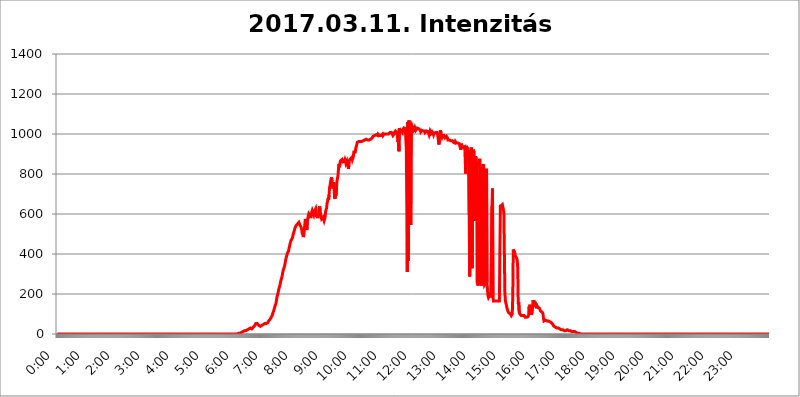
| Category | 2017.03.11. Intenzitás [W/m^2] |
|---|---|
| 0.0 | 0 |
| 0.0006944444444444445 | 0 |
| 0.001388888888888889 | 0 |
| 0.0020833333333333333 | 0 |
| 0.002777777777777778 | 0 |
| 0.003472222222222222 | 0 |
| 0.004166666666666667 | 0 |
| 0.004861111111111111 | 0 |
| 0.005555555555555556 | 0 |
| 0.0062499999999999995 | 0 |
| 0.006944444444444444 | 0 |
| 0.007638888888888889 | 0 |
| 0.008333333333333333 | 0 |
| 0.009027777777777779 | 0 |
| 0.009722222222222222 | 0 |
| 0.010416666666666666 | 0 |
| 0.011111111111111112 | 0 |
| 0.011805555555555555 | 0 |
| 0.012499999999999999 | 0 |
| 0.013194444444444444 | 0 |
| 0.013888888888888888 | 0 |
| 0.014583333333333332 | 0 |
| 0.015277777777777777 | 0 |
| 0.015972222222222224 | 0 |
| 0.016666666666666666 | 0 |
| 0.017361111111111112 | 0 |
| 0.018055555555555557 | 0 |
| 0.01875 | 0 |
| 0.019444444444444445 | 0 |
| 0.02013888888888889 | 0 |
| 0.020833333333333332 | 0 |
| 0.02152777777777778 | 0 |
| 0.022222222222222223 | 0 |
| 0.02291666666666667 | 0 |
| 0.02361111111111111 | 0 |
| 0.024305555555555556 | 0 |
| 0.024999999999999998 | 0 |
| 0.025694444444444447 | 0 |
| 0.02638888888888889 | 0 |
| 0.027083333333333334 | 0 |
| 0.027777777777777776 | 0 |
| 0.02847222222222222 | 0 |
| 0.029166666666666664 | 0 |
| 0.029861111111111113 | 0 |
| 0.030555555555555555 | 0 |
| 0.03125 | 0 |
| 0.03194444444444445 | 0 |
| 0.03263888888888889 | 0 |
| 0.03333333333333333 | 0 |
| 0.034027777777777775 | 0 |
| 0.034722222222222224 | 0 |
| 0.035416666666666666 | 0 |
| 0.036111111111111115 | 0 |
| 0.03680555555555556 | 0 |
| 0.0375 | 0 |
| 0.03819444444444444 | 0 |
| 0.03888888888888889 | 0 |
| 0.03958333333333333 | 0 |
| 0.04027777777777778 | 0 |
| 0.04097222222222222 | 0 |
| 0.041666666666666664 | 0 |
| 0.042361111111111106 | 0 |
| 0.04305555555555556 | 0 |
| 0.043750000000000004 | 0 |
| 0.044444444444444446 | 0 |
| 0.04513888888888889 | 0 |
| 0.04583333333333334 | 0 |
| 0.04652777777777778 | 0 |
| 0.04722222222222222 | 0 |
| 0.04791666666666666 | 0 |
| 0.04861111111111111 | 0 |
| 0.049305555555555554 | 0 |
| 0.049999999999999996 | 0 |
| 0.05069444444444445 | 0 |
| 0.051388888888888894 | 0 |
| 0.052083333333333336 | 0 |
| 0.05277777777777778 | 0 |
| 0.05347222222222222 | 0 |
| 0.05416666666666667 | 0 |
| 0.05486111111111111 | 0 |
| 0.05555555555555555 | 0 |
| 0.05625 | 0 |
| 0.05694444444444444 | 0 |
| 0.057638888888888885 | 0 |
| 0.05833333333333333 | 0 |
| 0.05902777777777778 | 0 |
| 0.059722222222222225 | 0 |
| 0.06041666666666667 | 0 |
| 0.061111111111111116 | 0 |
| 0.06180555555555556 | 0 |
| 0.0625 | 0 |
| 0.06319444444444444 | 0 |
| 0.06388888888888888 | 0 |
| 0.06458333333333334 | 0 |
| 0.06527777777777778 | 0 |
| 0.06597222222222222 | 0 |
| 0.06666666666666667 | 0 |
| 0.06736111111111111 | 0 |
| 0.06805555555555555 | 0 |
| 0.06874999999999999 | 0 |
| 0.06944444444444443 | 0 |
| 0.07013888888888889 | 0 |
| 0.07083333333333333 | 0 |
| 0.07152777777777779 | 0 |
| 0.07222222222222223 | 0 |
| 0.07291666666666667 | 0 |
| 0.07361111111111111 | 0 |
| 0.07430555555555556 | 0 |
| 0.075 | 0 |
| 0.07569444444444444 | 0 |
| 0.0763888888888889 | 0 |
| 0.07708333333333334 | 0 |
| 0.07777777777777778 | 0 |
| 0.07847222222222222 | 0 |
| 0.07916666666666666 | 0 |
| 0.0798611111111111 | 0 |
| 0.08055555555555556 | 0 |
| 0.08125 | 0 |
| 0.08194444444444444 | 0 |
| 0.08263888888888889 | 0 |
| 0.08333333333333333 | 0 |
| 0.08402777777777777 | 0 |
| 0.08472222222222221 | 0 |
| 0.08541666666666665 | 0 |
| 0.08611111111111112 | 0 |
| 0.08680555555555557 | 0 |
| 0.08750000000000001 | 0 |
| 0.08819444444444445 | 0 |
| 0.08888888888888889 | 0 |
| 0.08958333333333333 | 0 |
| 0.09027777777777778 | 0 |
| 0.09097222222222222 | 0 |
| 0.09166666666666667 | 0 |
| 0.09236111111111112 | 0 |
| 0.09305555555555556 | 0 |
| 0.09375 | 0 |
| 0.09444444444444444 | 0 |
| 0.09513888888888888 | 0 |
| 0.09583333333333333 | 0 |
| 0.09652777777777777 | 0 |
| 0.09722222222222222 | 0 |
| 0.09791666666666667 | 0 |
| 0.09861111111111111 | 0 |
| 0.09930555555555555 | 0 |
| 0.09999999999999999 | 0 |
| 0.10069444444444443 | 0 |
| 0.1013888888888889 | 0 |
| 0.10208333333333335 | 0 |
| 0.10277777777777779 | 0 |
| 0.10347222222222223 | 0 |
| 0.10416666666666667 | 0 |
| 0.10486111111111111 | 0 |
| 0.10555555555555556 | 0 |
| 0.10625 | 0 |
| 0.10694444444444444 | 0 |
| 0.1076388888888889 | 0 |
| 0.10833333333333334 | 0 |
| 0.10902777777777778 | 0 |
| 0.10972222222222222 | 0 |
| 0.1111111111111111 | 0 |
| 0.11180555555555556 | 0 |
| 0.11180555555555556 | 0 |
| 0.1125 | 0 |
| 0.11319444444444444 | 0 |
| 0.11388888888888889 | 0 |
| 0.11458333333333333 | 0 |
| 0.11527777777777777 | 0 |
| 0.11597222222222221 | 0 |
| 0.11666666666666665 | 0 |
| 0.1173611111111111 | 0 |
| 0.11805555555555557 | 0 |
| 0.11944444444444445 | 0 |
| 0.12013888888888889 | 0 |
| 0.12083333333333333 | 0 |
| 0.12152777777777778 | 0 |
| 0.12222222222222223 | 0 |
| 0.12291666666666667 | 0 |
| 0.12291666666666667 | 0 |
| 0.12361111111111112 | 0 |
| 0.12430555555555556 | 0 |
| 0.125 | 0 |
| 0.12569444444444444 | 0 |
| 0.12638888888888888 | 0 |
| 0.12708333333333333 | 0 |
| 0.16875 | 0 |
| 0.12847222222222224 | 0 |
| 0.12916666666666668 | 0 |
| 0.12986111111111112 | 0 |
| 0.13055555555555556 | 0 |
| 0.13125 | 0 |
| 0.13194444444444445 | 0 |
| 0.1326388888888889 | 0 |
| 0.13333333333333333 | 0 |
| 0.13402777777777777 | 0 |
| 0.13402777777777777 | 0 |
| 0.13472222222222222 | 0 |
| 0.13541666666666666 | 0 |
| 0.1361111111111111 | 0 |
| 0.13749999999999998 | 0 |
| 0.13819444444444443 | 0 |
| 0.1388888888888889 | 0 |
| 0.13958333333333334 | 0 |
| 0.14027777777777778 | 0 |
| 0.14097222222222222 | 0 |
| 0.14166666666666666 | 0 |
| 0.1423611111111111 | 0 |
| 0.14305555555555557 | 0 |
| 0.14375000000000002 | 0 |
| 0.14444444444444446 | 0 |
| 0.1451388888888889 | 0 |
| 0.1451388888888889 | 0 |
| 0.14652777777777778 | 0 |
| 0.14722222222222223 | 0 |
| 0.14791666666666667 | 0 |
| 0.1486111111111111 | 0 |
| 0.14930555555555555 | 0 |
| 0.15 | 0 |
| 0.15069444444444444 | 0 |
| 0.15138888888888888 | 0 |
| 0.15208333333333332 | 0 |
| 0.15277777777777776 | 0 |
| 0.15347222222222223 | 0 |
| 0.15416666666666667 | 0 |
| 0.15486111111111112 | 0 |
| 0.15555555555555556 | 0 |
| 0.15625 | 0 |
| 0.15694444444444444 | 0 |
| 0.15763888888888888 | 0 |
| 0.15833333333333333 | 0 |
| 0.15902777777777777 | 0 |
| 0.15972222222222224 | 0 |
| 0.16041666666666668 | 0 |
| 0.16111111111111112 | 0 |
| 0.16180555555555556 | 0 |
| 0.1625 | 0 |
| 0.16319444444444445 | 0 |
| 0.1638888888888889 | 0 |
| 0.16458333333333333 | 0 |
| 0.16527777777777777 | 0 |
| 0.16597222222222222 | 0 |
| 0.16666666666666666 | 0 |
| 0.1673611111111111 | 0 |
| 0.16805555555555554 | 0 |
| 0.16874999999999998 | 0 |
| 0.16944444444444443 | 0 |
| 0.17013888888888887 | 0 |
| 0.1708333333333333 | 0 |
| 0.17152777777777775 | 0 |
| 0.17222222222222225 | 0 |
| 0.1729166666666667 | 0 |
| 0.17361111111111113 | 0 |
| 0.17430555555555557 | 0 |
| 0.17500000000000002 | 0 |
| 0.17569444444444446 | 0 |
| 0.1763888888888889 | 0 |
| 0.17708333333333334 | 0 |
| 0.17777777777777778 | 0 |
| 0.17847222222222223 | 0 |
| 0.17916666666666667 | 0 |
| 0.1798611111111111 | 0 |
| 0.18055555555555555 | 0 |
| 0.18125 | 0 |
| 0.18194444444444444 | 0 |
| 0.1826388888888889 | 0 |
| 0.18333333333333335 | 0 |
| 0.1840277777777778 | 0 |
| 0.18472222222222223 | 0 |
| 0.18541666666666667 | 0 |
| 0.18611111111111112 | 0 |
| 0.18680555555555556 | 0 |
| 0.1875 | 0 |
| 0.18819444444444444 | 0 |
| 0.18888888888888888 | 0 |
| 0.18958333333333333 | 0 |
| 0.19027777777777777 | 0 |
| 0.1909722222222222 | 0 |
| 0.19166666666666665 | 0 |
| 0.19236111111111112 | 0 |
| 0.19305555555555554 | 0 |
| 0.19375 | 0 |
| 0.19444444444444445 | 0 |
| 0.1951388888888889 | 0 |
| 0.19583333333333333 | 0 |
| 0.19652777777777777 | 0 |
| 0.19722222222222222 | 0 |
| 0.19791666666666666 | 0 |
| 0.1986111111111111 | 0 |
| 0.19930555555555554 | 0 |
| 0.19999999999999998 | 0 |
| 0.20069444444444443 | 0 |
| 0.20138888888888887 | 0 |
| 0.2020833333333333 | 0 |
| 0.2027777777777778 | 0 |
| 0.2034722222222222 | 0 |
| 0.2041666666666667 | 0 |
| 0.20486111111111113 | 0 |
| 0.20555555555555557 | 0 |
| 0.20625000000000002 | 0 |
| 0.20694444444444446 | 0 |
| 0.2076388888888889 | 0 |
| 0.20833333333333334 | 0 |
| 0.20902777777777778 | 0 |
| 0.20972222222222223 | 0 |
| 0.21041666666666667 | 0 |
| 0.2111111111111111 | 0 |
| 0.21180555555555555 | 0 |
| 0.2125 | 0 |
| 0.21319444444444444 | 0 |
| 0.2138888888888889 | 0 |
| 0.21458333333333335 | 0 |
| 0.2152777777777778 | 0 |
| 0.21597222222222223 | 0 |
| 0.21666666666666667 | 0 |
| 0.21736111111111112 | 0 |
| 0.21805555555555556 | 0 |
| 0.21875 | 0 |
| 0.21944444444444444 | 0 |
| 0.22013888888888888 | 0 |
| 0.22083333333333333 | 0 |
| 0.22152777777777777 | 0 |
| 0.2222222222222222 | 0 |
| 0.22291666666666665 | 0 |
| 0.2236111111111111 | 0 |
| 0.22430555555555556 | 0 |
| 0.225 | 0 |
| 0.22569444444444445 | 0 |
| 0.2263888888888889 | 0 |
| 0.22708333333333333 | 0 |
| 0.22777777777777777 | 0 |
| 0.22847222222222222 | 0 |
| 0.22916666666666666 | 0 |
| 0.2298611111111111 | 0 |
| 0.23055555555555554 | 0 |
| 0.23124999999999998 | 0 |
| 0.23194444444444443 | 0 |
| 0.23263888888888887 | 0 |
| 0.2333333333333333 | 0 |
| 0.2340277777777778 | 0 |
| 0.2347222222222222 | 0 |
| 0.2354166666666667 | 0 |
| 0.23611111111111113 | 0 |
| 0.23680555555555557 | 0 |
| 0.23750000000000002 | 0 |
| 0.23819444444444446 | 0 |
| 0.2388888888888889 | 0 |
| 0.23958333333333334 | 0 |
| 0.24027777777777778 | 0 |
| 0.24097222222222223 | 0 |
| 0.24166666666666667 | 0 |
| 0.2423611111111111 | 0 |
| 0.24305555555555555 | 0 |
| 0.24375 | 0 |
| 0.24444444444444446 | 0 |
| 0.24513888888888888 | 0 |
| 0.24583333333333335 | 0 |
| 0.2465277777777778 | 0 |
| 0.24722222222222223 | 0 |
| 0.24791666666666667 | 0 |
| 0.24861111111111112 | 0 |
| 0.24930555555555556 | 0 |
| 0.25 | 0 |
| 0.25069444444444444 | 0 |
| 0.2513888888888889 | 0 |
| 0.2520833333333333 | 0 |
| 0.25277777777777777 | 0 |
| 0.2534722222222222 | 3.525 |
| 0.25416666666666665 | 3.525 |
| 0.2548611111111111 | 3.525 |
| 0.2555555555555556 | 3.525 |
| 0.25625000000000003 | 3.525 |
| 0.2569444444444445 | 7.887 |
| 0.2576388888888889 | 7.887 |
| 0.25833333333333336 | 7.887 |
| 0.2590277777777778 | 7.887 |
| 0.25972222222222224 | 7.887 |
| 0.2604166666666667 | 12.257 |
| 0.2611111111111111 | 12.257 |
| 0.26180555555555557 | 16.636 |
| 0.2625 | 16.636 |
| 0.26319444444444445 | 16.636 |
| 0.2638888888888889 | 16.636 |
| 0.26458333333333334 | 16.636 |
| 0.2652777777777778 | 16.636 |
| 0.2659722222222222 | 21.024 |
| 0.26666666666666666 | 21.024 |
| 0.2673611111111111 | 21.024 |
| 0.26805555555555555 | 25.419 |
| 0.26875 | 25.419 |
| 0.26944444444444443 | 29.823 |
| 0.2701388888888889 | 29.823 |
| 0.2708333333333333 | 29.823 |
| 0.27152777777777776 | 25.419 |
| 0.2722222222222222 | 25.419 |
| 0.27291666666666664 | 25.419 |
| 0.2736111111111111 | 29.823 |
| 0.2743055555555555 | 29.823 |
| 0.27499999999999997 | 34.234 |
| 0.27569444444444446 | 34.234 |
| 0.27638888888888885 | 38.653 |
| 0.27708333333333335 | 43.079 |
| 0.2777777777777778 | 47.511 |
| 0.27847222222222223 | 51.951 |
| 0.2791666666666667 | 56.398 |
| 0.2798611111111111 | 56.398 |
| 0.28055555555555556 | 51.951 |
| 0.28125 | 51.951 |
| 0.28194444444444444 | 47.511 |
| 0.2826388888888889 | 43.079 |
| 0.2833333333333333 | 43.079 |
| 0.28402777777777777 | 38.653 |
| 0.2847222222222222 | 38.653 |
| 0.28541666666666665 | 43.079 |
| 0.28611111111111115 | 43.079 |
| 0.28680555555555554 | 43.079 |
| 0.28750000000000003 | 47.511 |
| 0.2881944444444445 | 47.511 |
| 0.2888888888888889 | 47.511 |
| 0.28958333333333336 | 47.511 |
| 0.2902777777777778 | 47.511 |
| 0.29097222222222224 | 51.951 |
| 0.2916666666666667 | 51.951 |
| 0.2923611111111111 | 51.951 |
| 0.29305555555555557 | 51.951 |
| 0.29375 | 56.398 |
| 0.29444444444444445 | 56.398 |
| 0.2951388888888889 | 56.398 |
| 0.29583333333333334 | 60.85 |
| 0.2965277777777778 | 65.31 |
| 0.2972222222222222 | 65.31 |
| 0.29791666666666666 | 69.775 |
| 0.2986111111111111 | 74.246 |
| 0.29930555555555555 | 78.722 |
| 0.3 | 83.205 |
| 0.30069444444444443 | 87.692 |
| 0.3013888888888889 | 92.184 |
| 0.3020833333333333 | 101.184 |
| 0.30277777777777776 | 105.69 |
| 0.3034722222222222 | 114.716 |
| 0.30416666666666664 | 123.758 |
| 0.3048611111111111 | 132.814 |
| 0.3055555555555555 | 141.884 |
| 0.30624999999999997 | 146.423 |
| 0.3069444444444444 | 155.509 |
| 0.3076388888888889 | 173.709 |
| 0.30833333333333335 | 187.378 |
| 0.3090277777777778 | 191.937 |
| 0.30972222222222223 | 205.62 |
| 0.3104166666666667 | 219.309 |
| 0.3111111111111111 | 228.436 |
| 0.31180555555555556 | 237.564 |
| 0.3125 | 246.689 |
| 0.31319444444444444 | 260.373 |
| 0.3138888888888889 | 269.49 |
| 0.3145833333333333 | 274.047 |
| 0.31527777777777777 | 287.709 |
| 0.3159722222222222 | 301.354 |
| 0.31666666666666665 | 314.98 |
| 0.31736111111111115 | 324.052 |
| 0.31805555555555554 | 328.584 |
| 0.31875000000000003 | 337.639 |
| 0.3194444444444445 | 351.198 |
| 0.3201388888888889 | 364.728 |
| 0.32083333333333336 | 378.224 |
| 0.3215277777777778 | 387.202 |
| 0.32222222222222224 | 396.164 |
| 0.3229166666666667 | 405.108 |
| 0.3236111111111111 | 409.574 |
| 0.32430555555555557 | 414.035 |
| 0.325 | 427.39 |
| 0.32569444444444445 | 436.27 |
| 0.3263888888888889 | 449.551 |
| 0.32708333333333334 | 458.38 |
| 0.3277777777777778 | 467.187 |
| 0.3284722222222222 | 471.582 |
| 0.32916666666666666 | 471.582 |
| 0.3298611111111111 | 480.356 |
| 0.33055555555555555 | 493.475 |
| 0.33125 | 502.192 |
| 0.33194444444444443 | 510.885 |
| 0.3326388888888889 | 519.555 |
| 0.3333333333333333 | 528.2 |
| 0.3340277777777778 | 532.513 |
| 0.3347222222222222 | 541.121 |
| 0.3354166666666667 | 545.416 |
| 0.3361111111111111 | 545.416 |
| 0.3368055555555556 | 549.704 |
| 0.33749999999999997 | 553.986 |
| 0.33819444444444446 | 549.704 |
| 0.33888888888888885 | 558.261 |
| 0.33958333333333335 | 558.261 |
| 0.34027777777777773 | 545.416 |
| 0.34097222222222223 | 545.416 |
| 0.3416666666666666 | 536.82 |
| 0.3423611111111111 | 541.121 |
| 0.3430555555555555 | 519.555 |
| 0.34375 | 497.836 |
| 0.3444444444444445 | 523.88 |
| 0.3451388888888889 | 484.735 |
| 0.3458333333333334 | 493.475 |
| 0.34652777777777777 | 497.836 |
| 0.34722222222222227 | 493.475 |
| 0.34791666666666665 | 575.299 |
| 0.34861111111111115 | 575.299 |
| 0.34930555555555554 | 553.986 |
| 0.35000000000000003 | 519.555 |
| 0.3506944444444444 | 558.261 |
| 0.3513888888888889 | 562.53 |
| 0.3520833333333333 | 592.233 |
| 0.3527777777777778 | 600.661 |
| 0.3534722222222222 | 600.661 |
| 0.3541666666666667 | 592.233 |
| 0.3548611111111111 | 592.233 |
| 0.35555555555555557 | 579.542 |
| 0.35625 | 600.661 |
| 0.35694444444444445 | 609.062 |
| 0.3576388888888889 | 617.436 |
| 0.35833333333333334 | 621.613 |
| 0.3590277777777778 | 617.436 |
| 0.3597222222222222 | 596.45 |
| 0.36041666666666666 | 609.062 |
| 0.3611111111111111 | 609.062 |
| 0.36180555555555555 | 609.062 |
| 0.3625 | 625.784 |
| 0.36319444444444443 | 621.613 |
| 0.3638888888888889 | 583.779 |
| 0.3645833333333333 | 592.233 |
| 0.3652777777777778 | 579.542 |
| 0.3659722222222222 | 588.009 |
| 0.3666666666666667 | 600.661 |
| 0.3673611111111111 | 629.948 |
| 0.3680555555555556 | 638.256 |
| 0.36874999999999997 | 617.436 |
| 0.36944444444444446 | 596.45 |
| 0.37013888888888885 | 592.233 |
| 0.37083333333333335 | 575.299 |
| 0.37152777777777773 | 579.542 |
| 0.37222222222222223 | 575.299 |
| 0.3729166666666666 | 583.779 |
| 0.3736111111111111 | 575.299 |
| 0.3743055555555555 | 566.793 |
| 0.375 | 575.299 |
| 0.3756944444444445 | 583.779 |
| 0.3763888888888889 | 613.252 |
| 0.3770833333333334 | 617.436 |
| 0.37777777777777777 | 629.948 |
| 0.37847222222222227 | 654.791 |
| 0.37916666666666665 | 663.019 |
| 0.37986111111111115 | 679.395 |
| 0.38055555555555554 | 671.22 |
| 0.38125000000000003 | 695.666 |
| 0.3819444444444444 | 731.896 |
| 0.3826388888888889 | 743.859 |
| 0.3833333333333333 | 743.859 |
| 0.3840277777777778 | 775.492 |
| 0.3847222222222222 | 783.342 |
| 0.3854166666666667 | 763.674 |
| 0.3861111111111111 | 727.896 |
| 0.38680555555555557 | 739.877 |
| 0.3875 | 759.723 |
| 0.38819444444444445 | 743.859 |
| 0.3888888888888889 | 683.473 |
| 0.38958333333333334 | 675.311 |
| 0.3902777777777778 | 703.762 |
| 0.3909722222222222 | 691.608 |
| 0.39166666666666666 | 731.896 |
| 0.3923611111111111 | 767.62 |
| 0.39305555555555555 | 767.62 |
| 0.39375 | 791.169 |
| 0.39444444444444443 | 826.123 |
| 0.3951388888888889 | 849.199 |
| 0.3958333333333333 | 833.834 |
| 0.3965277777777778 | 853.029 |
| 0.3972222222222222 | 864.493 |
| 0.3979166666666667 | 860.676 |
| 0.3986111111111111 | 868.305 |
| 0.3993055555555556 | 872.114 |
| 0.39999999999999997 | 872.114 |
| 0.40069444444444446 | 860.676 |
| 0.40138888888888885 | 864.493 |
| 0.40208333333333335 | 860.676 |
| 0.40277777777777773 | 864.493 |
| 0.40347222222222223 | 872.114 |
| 0.4041666666666666 | 864.493 |
| 0.4048611111111111 | 853.029 |
| 0.4055555555555555 | 853.029 |
| 0.40625 | 864.493 |
| 0.4069444444444445 | 853.029 |
| 0.4076388888888889 | 841.526 |
| 0.4083333333333334 | 826.123 |
| 0.40902777777777777 | 845.365 |
| 0.40972222222222227 | 868.305 |
| 0.41041666666666665 | 868.305 |
| 0.41111111111111115 | 875.918 |
| 0.41180555555555554 | 872.114 |
| 0.41250000000000003 | 872.114 |
| 0.4131944444444444 | 883.516 |
| 0.4138888888888889 | 872.114 |
| 0.4145833333333333 | 868.305 |
| 0.4152777777777778 | 887.309 |
| 0.4159722222222222 | 909.996 |
| 0.4166666666666667 | 913.766 |
| 0.4173611111111111 | 913.766 |
| 0.41805555555555557 | 909.996 |
| 0.41875 | 928.819 |
| 0.41944444444444445 | 928.819 |
| 0.4201388888888889 | 947.58 |
| 0.42083333333333334 | 958.814 |
| 0.4215277777777778 | 958.814 |
| 0.4222222222222222 | 958.814 |
| 0.42291666666666666 | 962.555 |
| 0.4236111111111111 | 962.555 |
| 0.42430555555555555 | 962.555 |
| 0.425 | 962.555 |
| 0.42569444444444443 | 966.295 |
| 0.4263888888888889 | 966.295 |
| 0.4270833333333333 | 962.555 |
| 0.4277777777777778 | 966.295 |
| 0.4284722222222222 | 966.295 |
| 0.4291666666666667 | 966.295 |
| 0.4298611111111111 | 962.555 |
| 0.4305555555555556 | 966.295 |
| 0.43124999999999997 | 970.034 |
| 0.43194444444444446 | 970.034 |
| 0.43263888888888885 | 973.772 |
| 0.43333333333333335 | 973.772 |
| 0.43402777777777773 | 977.508 |
| 0.43472222222222223 | 973.772 |
| 0.4354166666666666 | 970.034 |
| 0.4361111111111111 | 973.772 |
| 0.4368055555555555 | 973.772 |
| 0.4375 | 970.034 |
| 0.4381944444444445 | 970.034 |
| 0.4388888888888889 | 973.772 |
| 0.4395833333333334 | 973.772 |
| 0.44027777777777777 | 973.772 |
| 0.44097222222222227 | 977.508 |
| 0.44166666666666665 | 981.244 |
| 0.44236111111111115 | 984.98 |
| 0.44305555555555554 | 988.714 |
| 0.44375000000000003 | 988.714 |
| 0.4444444444444444 | 992.448 |
| 0.4451388888888889 | 992.448 |
| 0.4458333333333333 | 992.448 |
| 0.4465277777777778 | 996.182 |
| 0.4472222222222222 | 996.182 |
| 0.4479166666666667 | 996.182 |
| 0.4486111111111111 | 992.448 |
| 0.44930555555555557 | 992.448 |
| 0.45 | 999.916 |
| 0.45069444444444445 | 996.182 |
| 0.4513888888888889 | 996.182 |
| 0.45208333333333334 | 992.448 |
| 0.4527777777777778 | 992.448 |
| 0.4534722222222222 | 992.448 |
| 0.45416666666666666 | 992.448 |
| 0.4548611111111111 | 992.448 |
| 0.45555555555555555 | 992.448 |
| 0.45625 | 999.916 |
| 0.45694444444444443 | 992.448 |
| 0.4576388888888889 | 988.714 |
| 0.4583333333333333 | 999.916 |
| 0.4590277777777778 | 999.916 |
| 0.4597222222222222 | 999.916 |
| 0.4604166666666667 | 999.916 |
| 0.4611111111111111 | 999.916 |
| 0.4618055555555556 | 999.916 |
| 0.46249999999999997 | 999.916 |
| 0.46319444444444446 | 999.916 |
| 0.46388888888888885 | 999.916 |
| 0.46458333333333335 | 999.916 |
| 0.46527777777777773 | 1003.65 |
| 0.46597222222222223 | 1003.65 |
| 0.4666666666666666 | 1007.383 |
| 0.4673611111111111 | 1007.383 |
| 0.4680555555555555 | 1003.65 |
| 0.46875 | 1007.383 |
| 0.4694444444444445 | 1007.383 |
| 0.4701388888888889 | 1003.65 |
| 0.4708333333333334 | 992.448 |
| 0.47152777777777777 | 988.714 |
| 0.47222222222222227 | 999.916 |
| 0.47291666666666665 | 1007.383 |
| 0.47361111111111115 | 1011.118 |
| 0.47430555555555554 | 1014.852 |
| 0.47500000000000003 | 1018.587 |
| 0.4756944444444444 | 1011.118 |
| 0.4763888888888889 | 1007.383 |
| 0.4770833333333333 | 992.448 |
| 0.4777777777777778 | 958.814 |
| 0.4784722222222222 | 977.508 |
| 0.4791666666666667 | 913.766 |
| 0.4798611111111111 | 1029.798 |
| 0.48055555555555557 | 1014.852 |
| 0.48125 | 1018.587 |
| 0.48194444444444445 | 1014.852 |
| 0.4826388888888889 | 1014.852 |
| 0.48333333333333334 | 1018.587 |
| 0.4840277777777778 | 1007.383 |
| 0.4847222222222222 | 1022.323 |
| 0.48541666666666666 | 1022.323 |
| 0.4861111111111111 | 1029.798 |
| 0.48680555555555555 | 1026.06 |
| 0.4875 | 1029.798 |
| 0.48819444444444443 | 1026.06 |
| 0.4888888888888889 | 1022.323 |
| 0.4895833333333333 | 925.06 |
| 0.4902777777777778 | 638.256 |
| 0.4909722222222222 | 310.44 |
| 0.4916666666666667 | 1059.756 |
| 0.4923611111111111 | 364.728 |
| 0.4930555555555556 | 1067.267 |
| 0.49374999999999997 | 1059.756 |
| 0.49444444444444446 | 1044.762 |
| 0.49513888888888885 | 1022.323 |
| 0.49583333333333335 | 545.416 |
| 0.49652777777777773 | 1037.277 |
| 0.49722222222222223 | 1044.762 |
| 0.4979166666666666 | 1037.277 |
| 0.4986111111111111 | 1037.277 |
| 0.4993055555555555 | 1029.798 |
| 0.5 | 1022.323 |
| 0.5006944444444444 | 1018.587 |
| 0.5013888888888889 | 1033.537 |
| 0.5020833333333333 | 1026.06 |
| 0.5027777777777778 | 1018.587 |
| 0.5034722222222222 | 1022.323 |
| 0.5041666666666667 | 1022.323 |
| 0.5048611111111111 | 1029.798 |
| 0.5055555555555555 | 1026.06 |
| 0.50625 | 1026.06 |
| 0.5069444444444444 | 1026.06 |
| 0.5076388888888889 | 1026.06 |
| 0.5083333333333333 | 1022.323 |
| 0.5090277777777777 | 1018.587 |
| 0.5097222222222222 | 1011.118 |
| 0.5104166666666666 | 1014.852 |
| 0.5111111111111112 | 1018.587 |
| 0.5118055555555555 | 1014.852 |
| 0.5125000000000001 | 1014.852 |
| 0.5131944444444444 | 1014.852 |
| 0.513888888888889 | 1014.852 |
| 0.5145833333333333 | 1014.852 |
| 0.5152777777777778 | 1014.852 |
| 0.5159722222222222 | 1007.383 |
| 0.5166666666666667 | 1007.383 |
| 0.517361111111111 | 1007.383 |
| 0.5180555555555556 | 1014.852 |
| 0.5187499999999999 | 1018.587 |
| 0.5194444444444445 | 1018.587 |
| 0.5201388888888888 | 1011.118 |
| 0.5208333333333334 | 1011.118 |
| 0.5215277777777778 | 996.182 |
| 0.5222222222222223 | 999.916 |
| 0.5229166666666667 | 1014.852 |
| 0.5236111111111111 | 1014.852 |
| 0.5243055555555556 | 1003.65 |
| 0.525 | 1003.65 |
| 0.5256944444444445 | 1011.118 |
| 0.5263888888888889 | 1011.118 |
| 0.5270833333333333 | 1003.65 |
| 0.5277777777777778 | 996.182 |
| 0.5284722222222222 | 1003.65 |
| 0.5291666666666667 | 1007.383 |
| 0.5298611111111111 | 1007.383 |
| 0.5305555555555556 | 1007.383 |
| 0.53125 | 1007.383 |
| 0.5319444444444444 | 1011.118 |
| 0.5326388888888889 | 1007.383 |
| 0.5333333333333333 | 999.916 |
| 0.5340277777777778 | 999.916 |
| 0.5347222222222222 | 1003.65 |
| 0.5354166666666667 | 947.58 |
| 0.5361111111111111 | 988.714 |
| 0.5368055555555555 | 1007.383 |
| 0.5375 | 1018.587 |
| 0.5381944444444444 | 1003.65 |
| 0.5388888888888889 | 992.448 |
| 0.5395833333333333 | 984.98 |
| 0.5402777777777777 | 992.448 |
| 0.5409722222222222 | 996.182 |
| 0.5416666666666666 | 992.448 |
| 0.5423611111111112 | 992.448 |
| 0.5430555555555555 | 992.448 |
| 0.5437500000000001 | 981.244 |
| 0.5444444444444444 | 984.98 |
| 0.545138888888889 | 984.98 |
| 0.5458333333333333 | 988.714 |
| 0.5465277777777778 | 988.714 |
| 0.5472222222222222 | 981.244 |
| 0.5479166666666667 | 970.034 |
| 0.548611111111111 | 970.034 |
| 0.5493055555555556 | 973.772 |
| 0.5499999999999999 | 970.034 |
| 0.5506944444444445 | 970.034 |
| 0.5513888888888888 | 966.295 |
| 0.5520833333333334 | 966.295 |
| 0.5527777777777778 | 970.034 |
| 0.5534722222222223 | 966.295 |
| 0.5541666666666667 | 966.295 |
| 0.5548611111111111 | 966.295 |
| 0.5555555555555556 | 958.814 |
| 0.55625 | 955.071 |
| 0.5569444444444445 | 955.071 |
| 0.5576388888888889 | 955.071 |
| 0.5583333333333333 | 962.555 |
| 0.5590277777777778 | 962.555 |
| 0.5597222222222222 | 955.071 |
| 0.5604166666666667 | 951.327 |
| 0.5611111111111111 | 955.071 |
| 0.5618055555555556 | 955.071 |
| 0.5625 | 955.071 |
| 0.5631944444444444 | 951.327 |
| 0.5638888888888889 | 951.327 |
| 0.5645833333333333 | 955.071 |
| 0.5652777777777778 | 951.327 |
| 0.5659722222222222 | 921.298 |
| 0.5666666666666667 | 951.327 |
| 0.5673611111111111 | 943.832 |
| 0.5680555555555555 | 940.082 |
| 0.56875 | 940.082 |
| 0.5694444444444444 | 932.576 |
| 0.5701388888888889 | 932.576 |
| 0.5708333333333333 | 936.33 |
| 0.5715277777777777 | 936.33 |
| 0.5722222222222222 | 940.082 |
| 0.5729166666666666 | 802.868 |
| 0.5736111111111112 | 940.082 |
| 0.5743055555555555 | 943.832 |
| 0.5750000000000001 | 943.832 |
| 0.5756944444444444 | 925.06 |
| 0.576388888888889 | 909.996 |
| 0.5770833333333333 | 917.534 |
| 0.5777777777777778 | 596.45 |
| 0.5784722222222222 | 287.709 |
| 0.5791666666666667 | 562.53 |
| 0.579861111111111 | 898.668 |
| 0.5805555555555556 | 932.576 |
| 0.5812499999999999 | 917.534 |
| 0.5819444444444445 | 328.584 |
| 0.5826388888888888 | 795.074 |
| 0.5833333333333334 | 921.298 |
| 0.5840277777777778 | 917.534 |
| 0.5847222222222223 | 909.996 |
| 0.5854166666666667 | 909.996 |
| 0.5861111111111111 | 566.793 |
| 0.5868055555555556 | 887.309 |
| 0.5875 | 875.918 |
| 0.5881944444444445 | 856.855 |
| 0.5888888888888889 | 260.373 |
| 0.5895833333333333 | 251.251 |
| 0.5902777777777778 | 242.127 |
| 0.5909722222222222 | 237.564 |
| 0.5916666666666667 | 278.603 |
| 0.5923611111111111 | 875.918 |
| 0.5930555555555556 | 829.981 |
| 0.59375 | 833.834 |
| 0.5944444444444444 | 841.526 |
| 0.5951388888888889 | 242.127 |
| 0.5958333333333333 | 747.834 |
| 0.5965277777777778 | 845.365 |
| 0.5972222222222222 | 837.682 |
| 0.5979166666666667 | 849.199 |
| 0.5986111111111111 | 274.047 |
| 0.5993055555555555 | 246.689 |
| 0.6 | 251.251 |
| 0.6006944444444444 | 255.813 |
| 0.6013888888888889 | 269.49 |
| 0.6020833333333333 | 826.123 |
| 0.6027777777777777 | 255.813 |
| 0.6034722222222222 | 219.309 |
| 0.6041666666666666 | 191.937 |
| 0.6048611111111112 | 182.82 |
| 0.6055555555555555 | 182.82 |
| 0.6062500000000001 | 191.937 |
| 0.6069444444444444 | 196.497 |
| 0.607638888888889 | 201.058 |
| 0.6083333333333333 | 182.82 |
| 0.6090277777777778 | 182.82 |
| 0.6097222222222222 | 638.256 |
| 0.6104166666666667 | 727.896 |
| 0.611111111111111 | 182.82 |
| 0.6118055555555556 | 164.605 |
| 0.6124999999999999 | 164.605 |
| 0.6131944444444445 | 160.056 |
| 0.6138888888888888 | 164.605 |
| 0.6145833333333334 | 164.605 |
| 0.6152777777777778 | 164.605 |
| 0.6159722222222223 | 164.605 |
| 0.6166666666666667 | 164.605 |
| 0.6173611111111111 | 164.605 |
| 0.6180555555555556 | 164.605 |
| 0.61875 | 160.056 |
| 0.6194444444444445 | 160.056 |
| 0.6201388888888889 | 164.605 |
| 0.6208333333333333 | 427.39 |
| 0.6215277777777778 | 646.537 |
| 0.6222222222222222 | 638.256 |
| 0.6229166666666667 | 642.4 |
| 0.6236111111111111 | 638.256 |
| 0.6243055555555556 | 646.537 |
| 0.625 | 634.105 |
| 0.6256944444444444 | 621.613 |
| 0.6263888888888889 | 609.062 |
| 0.6270833333333333 | 604.864 |
| 0.6277777777777778 | 210.182 |
| 0.6284722222222222 | 169.156 |
| 0.6291666666666667 | 155.509 |
| 0.6298611111111111 | 146.423 |
| 0.6305555555555555 | 132.814 |
| 0.63125 | 123.758 |
| 0.6319444444444444 | 114.716 |
| 0.6326388888888889 | 110.201 |
| 0.6333333333333333 | 105.69 |
| 0.6340277777777777 | 105.69 |
| 0.6347222222222222 | 101.184 |
| 0.6354166666666666 | 101.184 |
| 0.6361111111111112 | 96.682 |
| 0.6368055555555555 | 92.184 |
| 0.6375000000000001 | 96.682 |
| 0.6381944444444444 | 101.184 |
| 0.638888888888889 | 187.378 |
| 0.6395833333333333 | 422.943 |
| 0.6402777777777778 | 422.943 |
| 0.6409722222222222 | 418.492 |
| 0.6416666666666667 | 405.108 |
| 0.642361111111111 | 391.685 |
| 0.6430555555555556 | 387.202 |
| 0.6437499999999999 | 387.202 |
| 0.6444444444444445 | 378.224 |
| 0.6451388888888888 | 369.23 |
| 0.6458333333333334 | 328.584 |
| 0.6465277777777778 | 150.964 |
| 0.6472222222222223 | 160.056 |
| 0.6479166666666667 | 110.201 |
| 0.6486111111111111 | 101.184 |
| 0.6493055555555556 | 96.682 |
| 0.65 | 96.682 |
| 0.6506944444444445 | 92.184 |
| 0.6513888888888889 | 92.184 |
| 0.6520833333333333 | 92.184 |
| 0.6527777777777778 | 92.184 |
| 0.6534722222222222 | 92.184 |
| 0.6541666666666667 | 92.184 |
| 0.6548611111111111 | 92.184 |
| 0.6555555555555556 | 87.692 |
| 0.65625 | 83.205 |
| 0.6569444444444444 | 83.205 |
| 0.6576388888888889 | 83.205 |
| 0.6583333333333333 | 83.205 |
| 0.6590277777777778 | 83.205 |
| 0.6597222222222222 | 83.205 |
| 0.6604166666666667 | 87.692 |
| 0.6611111111111111 | 96.682 |
| 0.6618055555555555 | 137.347 |
| 0.6625 | 110.201 |
| 0.6631944444444444 | 146.423 |
| 0.6638888888888889 | 105.69 |
| 0.6645833333333333 | 137.347 |
| 0.6652777777777777 | 96.682 |
| 0.6659722222222222 | 92.184 |
| 0.6666666666666666 | 132.814 |
| 0.6673611111111111 | 169.156 |
| 0.6680555555555556 | 169.156 |
| 0.6687500000000001 | 146.423 |
| 0.6694444444444444 | 150.964 |
| 0.6701388888888888 | 155.509 |
| 0.6708333333333334 | 155.509 |
| 0.6715277777777778 | 146.423 |
| 0.6722222222222222 | 128.284 |
| 0.6729166666666666 | 141.884 |
| 0.6736111111111112 | 137.347 |
| 0.6743055555555556 | 132.814 |
| 0.6749999999999999 | 137.347 |
| 0.6756944444444444 | 132.814 |
| 0.6763888888888889 | 128.284 |
| 0.6770833333333334 | 128.284 |
| 0.6777777777777777 | 114.716 |
| 0.6784722222222223 | 119.235 |
| 0.6791666666666667 | 110.201 |
| 0.6798611111111111 | 110.201 |
| 0.6805555555555555 | 110.201 |
| 0.68125 | 101.184 |
| 0.6819444444444445 | 78.722 |
| 0.6826388888888889 | 65.31 |
| 0.6833333333333332 | 65.31 |
| 0.6840277777777778 | 65.31 |
| 0.6847222222222222 | 69.775 |
| 0.6854166666666667 | 65.31 |
| 0.686111111111111 | 65.31 |
| 0.6868055555555556 | 65.31 |
| 0.6875 | 65.31 |
| 0.6881944444444444 | 65.31 |
| 0.688888888888889 | 65.31 |
| 0.6895833333333333 | 65.31 |
| 0.6902777777777778 | 60.85 |
| 0.6909722222222222 | 60.85 |
| 0.6916666666666668 | 56.398 |
| 0.6923611111111111 | 56.398 |
| 0.6930555555555555 | 56.398 |
| 0.69375 | 56.398 |
| 0.6944444444444445 | 51.951 |
| 0.6951388888888889 | 47.511 |
| 0.6958333333333333 | 43.079 |
| 0.6965277777777777 | 38.653 |
| 0.6972222222222223 | 38.653 |
| 0.6979166666666666 | 38.653 |
| 0.6986111111111111 | 34.234 |
| 0.6993055555555556 | 34.234 |
| 0.7000000000000001 | 34.234 |
| 0.7006944444444444 | 29.823 |
| 0.7013888888888888 | 29.823 |
| 0.7020833333333334 | 29.823 |
| 0.7027777777777778 | 29.823 |
| 0.7034722222222222 | 25.419 |
| 0.7041666666666666 | 25.419 |
| 0.7048611111111112 | 25.419 |
| 0.7055555555555556 | 25.419 |
| 0.7062499999999999 | 21.024 |
| 0.7069444444444444 | 21.024 |
| 0.7076388888888889 | 21.024 |
| 0.7083333333333334 | 21.024 |
| 0.7090277777777777 | 21.024 |
| 0.7097222222222223 | 21.024 |
| 0.7104166666666667 | 16.636 |
| 0.7111111111111111 | 16.636 |
| 0.7118055555555555 | 16.636 |
| 0.7125 | 16.636 |
| 0.7131944444444445 | 16.636 |
| 0.7138888888888889 | 16.636 |
| 0.7145833333333332 | 21.024 |
| 0.7152777777777778 | 21.024 |
| 0.7159722222222222 | 16.636 |
| 0.7166666666666667 | 16.636 |
| 0.717361111111111 | 16.636 |
| 0.7180555555555556 | 16.636 |
| 0.71875 | 16.636 |
| 0.7194444444444444 | 16.636 |
| 0.720138888888889 | 16.636 |
| 0.7208333333333333 | 16.636 |
| 0.7215277777777778 | 12.257 |
| 0.7222222222222222 | 12.257 |
| 0.7229166666666668 | 12.257 |
| 0.7236111111111111 | 12.257 |
| 0.7243055555555555 | 12.257 |
| 0.725 | 12.257 |
| 0.7256944444444445 | 12.257 |
| 0.7263888888888889 | 7.887 |
| 0.7270833333333333 | 7.887 |
| 0.7277777777777777 | 7.887 |
| 0.7284722222222223 | 3.525 |
| 0.7291666666666666 | 3.525 |
| 0.7298611111111111 | 3.525 |
| 0.7305555555555556 | 3.525 |
| 0.7312500000000001 | 3.525 |
| 0.7319444444444444 | 3.525 |
| 0.7326388888888888 | 3.525 |
| 0.7333333333333334 | 3.525 |
| 0.7340277777777778 | 0 |
| 0.7347222222222222 | 0 |
| 0.7354166666666666 | 0 |
| 0.7361111111111112 | 0 |
| 0.7368055555555556 | 0 |
| 0.7374999999999999 | 0 |
| 0.7381944444444444 | 0 |
| 0.7388888888888889 | 0 |
| 0.7395833333333334 | 0 |
| 0.7402777777777777 | 0 |
| 0.7409722222222223 | 0 |
| 0.7416666666666667 | 0 |
| 0.7423611111111111 | 0 |
| 0.7430555555555555 | 0 |
| 0.74375 | 0 |
| 0.7444444444444445 | 0 |
| 0.7451388888888889 | 0 |
| 0.7458333333333332 | 0 |
| 0.7465277777777778 | 0 |
| 0.7472222222222222 | 0 |
| 0.7479166666666667 | 0 |
| 0.748611111111111 | 0 |
| 0.7493055555555556 | 0 |
| 0.75 | 0 |
| 0.7506944444444444 | 0 |
| 0.751388888888889 | 0 |
| 0.7520833333333333 | 0 |
| 0.7527777777777778 | 0 |
| 0.7534722222222222 | 0 |
| 0.7541666666666668 | 0 |
| 0.7548611111111111 | 0 |
| 0.7555555555555555 | 0 |
| 0.75625 | 0 |
| 0.7569444444444445 | 0 |
| 0.7576388888888889 | 0 |
| 0.7583333333333333 | 0 |
| 0.7590277777777777 | 0 |
| 0.7597222222222223 | 0 |
| 0.7604166666666666 | 0 |
| 0.7611111111111111 | 0 |
| 0.7618055555555556 | 0 |
| 0.7625000000000001 | 0 |
| 0.7631944444444444 | 0 |
| 0.7638888888888888 | 0 |
| 0.7645833333333334 | 0 |
| 0.7652777777777778 | 0 |
| 0.7659722222222222 | 0 |
| 0.7666666666666666 | 0 |
| 0.7673611111111112 | 0 |
| 0.7680555555555556 | 0 |
| 0.7687499999999999 | 0 |
| 0.7694444444444444 | 0 |
| 0.7701388888888889 | 0 |
| 0.7708333333333334 | 0 |
| 0.7715277777777777 | 0 |
| 0.7722222222222223 | 0 |
| 0.7729166666666667 | 0 |
| 0.7736111111111111 | 0 |
| 0.7743055555555555 | 0 |
| 0.775 | 0 |
| 0.7756944444444445 | 0 |
| 0.7763888888888889 | 0 |
| 0.7770833333333332 | 0 |
| 0.7777777777777778 | 0 |
| 0.7784722222222222 | 0 |
| 0.7791666666666667 | 0 |
| 0.779861111111111 | 0 |
| 0.7805555555555556 | 0 |
| 0.78125 | 0 |
| 0.7819444444444444 | 0 |
| 0.782638888888889 | 0 |
| 0.7833333333333333 | 0 |
| 0.7840277777777778 | 0 |
| 0.7847222222222222 | 0 |
| 0.7854166666666668 | 0 |
| 0.7861111111111111 | 0 |
| 0.7868055555555555 | 0 |
| 0.7875 | 0 |
| 0.7881944444444445 | 0 |
| 0.7888888888888889 | 0 |
| 0.7895833333333333 | 0 |
| 0.7902777777777777 | 0 |
| 0.7909722222222223 | 0 |
| 0.7916666666666666 | 0 |
| 0.7923611111111111 | 0 |
| 0.7930555555555556 | 0 |
| 0.7937500000000001 | 0 |
| 0.7944444444444444 | 0 |
| 0.7951388888888888 | 0 |
| 0.7958333333333334 | 0 |
| 0.7965277777777778 | 0 |
| 0.7972222222222222 | 0 |
| 0.7979166666666666 | 0 |
| 0.7986111111111112 | 0 |
| 0.7993055555555556 | 0 |
| 0.7999999999999999 | 0 |
| 0.8006944444444444 | 0 |
| 0.8013888888888889 | 0 |
| 0.8020833333333334 | 0 |
| 0.8027777777777777 | 0 |
| 0.8034722222222223 | 0 |
| 0.8041666666666667 | 0 |
| 0.8048611111111111 | 0 |
| 0.8055555555555555 | 0 |
| 0.80625 | 0 |
| 0.8069444444444445 | 0 |
| 0.8076388888888889 | 0 |
| 0.8083333333333332 | 0 |
| 0.8090277777777778 | 0 |
| 0.8097222222222222 | 0 |
| 0.8104166666666667 | 0 |
| 0.811111111111111 | 0 |
| 0.8118055555555556 | 0 |
| 0.8125 | 0 |
| 0.8131944444444444 | 0 |
| 0.813888888888889 | 0 |
| 0.8145833333333333 | 0 |
| 0.8152777777777778 | 0 |
| 0.8159722222222222 | 0 |
| 0.8166666666666668 | 0 |
| 0.8173611111111111 | 0 |
| 0.8180555555555555 | 0 |
| 0.81875 | 0 |
| 0.8194444444444445 | 0 |
| 0.8201388888888889 | 0 |
| 0.8208333333333333 | 0 |
| 0.8215277777777777 | 0 |
| 0.8222222222222223 | 0 |
| 0.8229166666666666 | 0 |
| 0.8236111111111111 | 0 |
| 0.8243055555555556 | 0 |
| 0.8250000000000001 | 0 |
| 0.8256944444444444 | 0 |
| 0.8263888888888888 | 0 |
| 0.8270833333333334 | 0 |
| 0.8277777777777778 | 0 |
| 0.8284722222222222 | 0 |
| 0.8291666666666666 | 0 |
| 0.8298611111111112 | 0 |
| 0.8305555555555556 | 0 |
| 0.8312499999999999 | 0 |
| 0.8319444444444444 | 0 |
| 0.8326388888888889 | 0 |
| 0.8333333333333334 | 0 |
| 0.8340277777777777 | 0 |
| 0.8347222222222223 | 0 |
| 0.8354166666666667 | 0 |
| 0.8361111111111111 | 0 |
| 0.8368055555555555 | 0 |
| 0.8375 | 0 |
| 0.8381944444444445 | 0 |
| 0.8388888888888889 | 0 |
| 0.8395833333333332 | 0 |
| 0.8402777777777778 | 0 |
| 0.8409722222222222 | 0 |
| 0.8416666666666667 | 0 |
| 0.842361111111111 | 0 |
| 0.8430555555555556 | 0 |
| 0.84375 | 0 |
| 0.8444444444444444 | 0 |
| 0.845138888888889 | 0 |
| 0.8458333333333333 | 0 |
| 0.8465277777777778 | 0 |
| 0.8472222222222222 | 0 |
| 0.8479166666666668 | 0 |
| 0.8486111111111111 | 0 |
| 0.8493055555555555 | 0 |
| 0.85 | 0 |
| 0.8506944444444445 | 0 |
| 0.8513888888888889 | 0 |
| 0.8520833333333333 | 0 |
| 0.8527777777777777 | 0 |
| 0.8534722222222223 | 0 |
| 0.8541666666666666 | 0 |
| 0.8548611111111111 | 0 |
| 0.8555555555555556 | 0 |
| 0.8562500000000001 | 0 |
| 0.8569444444444444 | 0 |
| 0.8576388888888888 | 0 |
| 0.8583333333333334 | 0 |
| 0.8590277777777778 | 0 |
| 0.8597222222222222 | 0 |
| 0.8604166666666666 | 0 |
| 0.8611111111111112 | 0 |
| 0.8618055555555556 | 0 |
| 0.8624999999999999 | 0 |
| 0.8631944444444444 | 0 |
| 0.8638888888888889 | 0 |
| 0.8645833333333334 | 0 |
| 0.8652777777777777 | 0 |
| 0.8659722222222223 | 0 |
| 0.8666666666666667 | 0 |
| 0.8673611111111111 | 0 |
| 0.8680555555555555 | 0 |
| 0.86875 | 0 |
| 0.8694444444444445 | 0 |
| 0.8701388888888889 | 0 |
| 0.8708333333333332 | 0 |
| 0.8715277777777778 | 0 |
| 0.8722222222222222 | 0 |
| 0.8729166666666667 | 0 |
| 0.873611111111111 | 0 |
| 0.8743055555555556 | 0 |
| 0.875 | 0 |
| 0.8756944444444444 | 0 |
| 0.876388888888889 | 0 |
| 0.8770833333333333 | 0 |
| 0.8777777777777778 | 0 |
| 0.8784722222222222 | 0 |
| 0.8791666666666668 | 0 |
| 0.8798611111111111 | 0 |
| 0.8805555555555555 | 0 |
| 0.88125 | 0 |
| 0.8819444444444445 | 0 |
| 0.8826388888888889 | 0 |
| 0.8833333333333333 | 0 |
| 0.8840277777777777 | 0 |
| 0.8847222222222223 | 0 |
| 0.8854166666666666 | 0 |
| 0.8861111111111111 | 0 |
| 0.8868055555555556 | 0 |
| 0.8875000000000001 | 0 |
| 0.8881944444444444 | 0 |
| 0.8888888888888888 | 0 |
| 0.8895833333333334 | 0 |
| 0.8902777777777778 | 0 |
| 0.8909722222222222 | 0 |
| 0.8916666666666666 | 0 |
| 0.8923611111111112 | 0 |
| 0.8930555555555556 | 0 |
| 0.8937499999999999 | 0 |
| 0.8944444444444444 | 0 |
| 0.8951388888888889 | 0 |
| 0.8958333333333334 | 0 |
| 0.8965277777777777 | 0 |
| 0.8972222222222223 | 0 |
| 0.8979166666666667 | 0 |
| 0.8986111111111111 | 0 |
| 0.8993055555555555 | 0 |
| 0.9 | 0 |
| 0.9006944444444445 | 0 |
| 0.9013888888888889 | 0 |
| 0.9020833333333332 | 0 |
| 0.9027777777777778 | 0 |
| 0.9034722222222222 | 0 |
| 0.9041666666666667 | 0 |
| 0.904861111111111 | 0 |
| 0.9055555555555556 | 0 |
| 0.90625 | 0 |
| 0.9069444444444444 | 0 |
| 0.907638888888889 | 0 |
| 0.9083333333333333 | 0 |
| 0.9090277777777778 | 0 |
| 0.9097222222222222 | 0 |
| 0.9104166666666668 | 0 |
| 0.9111111111111111 | 0 |
| 0.9118055555555555 | 0 |
| 0.9125 | 0 |
| 0.9131944444444445 | 0 |
| 0.9138888888888889 | 0 |
| 0.9145833333333333 | 0 |
| 0.9152777777777777 | 0 |
| 0.9159722222222223 | 0 |
| 0.9166666666666666 | 0 |
| 0.9173611111111111 | 0 |
| 0.9180555555555556 | 0 |
| 0.9187500000000001 | 0 |
| 0.9194444444444444 | 0 |
| 0.9201388888888888 | 0 |
| 0.9208333333333334 | 0 |
| 0.9215277777777778 | 0 |
| 0.9222222222222222 | 0 |
| 0.9229166666666666 | 0 |
| 0.9236111111111112 | 0 |
| 0.9243055555555556 | 0 |
| 0.9249999999999999 | 0 |
| 0.9256944444444444 | 0 |
| 0.9263888888888889 | 0 |
| 0.9270833333333334 | 0 |
| 0.9277777777777777 | 0 |
| 0.9284722222222223 | 0 |
| 0.9291666666666667 | 0 |
| 0.9298611111111111 | 0 |
| 0.9305555555555555 | 0 |
| 0.93125 | 0 |
| 0.9319444444444445 | 0 |
| 0.9326388888888889 | 0 |
| 0.9333333333333332 | 0 |
| 0.9340277777777778 | 0 |
| 0.9347222222222222 | 0 |
| 0.9354166666666667 | 0 |
| 0.936111111111111 | 0 |
| 0.9368055555555556 | 0 |
| 0.9375 | 0 |
| 0.9381944444444444 | 0 |
| 0.938888888888889 | 0 |
| 0.9395833333333333 | 0 |
| 0.9402777777777778 | 0 |
| 0.9409722222222222 | 0 |
| 0.9416666666666668 | 0 |
| 0.9423611111111111 | 0 |
| 0.9430555555555555 | 0 |
| 0.94375 | 0 |
| 0.9444444444444445 | 0 |
| 0.9451388888888889 | 0 |
| 0.9458333333333333 | 0 |
| 0.9465277777777777 | 0 |
| 0.9472222222222223 | 0 |
| 0.9479166666666666 | 0 |
| 0.9486111111111111 | 0 |
| 0.9493055555555556 | 0 |
| 0.9500000000000001 | 0 |
| 0.9506944444444444 | 0 |
| 0.9513888888888888 | 0 |
| 0.9520833333333334 | 0 |
| 0.9527777777777778 | 0 |
| 0.9534722222222222 | 0 |
| 0.9541666666666666 | 0 |
| 0.9548611111111112 | 0 |
| 0.9555555555555556 | 0 |
| 0.9562499999999999 | 0 |
| 0.9569444444444444 | 0 |
| 0.9576388888888889 | 0 |
| 0.9583333333333334 | 0 |
| 0.9590277777777777 | 0 |
| 0.9597222222222223 | 0 |
| 0.9604166666666667 | 0 |
| 0.9611111111111111 | 0 |
| 0.9618055555555555 | 0 |
| 0.9625 | 0 |
| 0.9631944444444445 | 0 |
| 0.9638888888888889 | 0 |
| 0.9645833333333332 | 0 |
| 0.9652777777777778 | 0 |
| 0.9659722222222222 | 0 |
| 0.9666666666666667 | 0 |
| 0.967361111111111 | 0 |
| 0.9680555555555556 | 0 |
| 0.96875 | 0 |
| 0.9694444444444444 | 0 |
| 0.970138888888889 | 0 |
| 0.9708333333333333 | 0 |
| 0.9715277777777778 | 0 |
| 0.9722222222222222 | 0 |
| 0.9729166666666668 | 0 |
| 0.9736111111111111 | 0 |
| 0.9743055555555555 | 0 |
| 0.975 | 0 |
| 0.9756944444444445 | 0 |
| 0.9763888888888889 | 0 |
| 0.9770833333333333 | 0 |
| 0.9777777777777777 | 0 |
| 0.9784722222222223 | 0 |
| 0.9791666666666666 | 0 |
| 0.9798611111111111 | 0 |
| 0.9805555555555556 | 0 |
| 0.9812500000000001 | 0 |
| 0.9819444444444444 | 0 |
| 0.9826388888888888 | 0 |
| 0.9833333333333334 | 0 |
| 0.9840277777777778 | 0 |
| 0.9847222222222222 | 0 |
| 0.9854166666666666 | 0 |
| 0.9861111111111112 | 0 |
| 0.9868055555555556 | 0 |
| 0.9874999999999999 | 0 |
| 0.9881944444444444 | 0 |
| 0.9888888888888889 | 0 |
| 0.9895833333333334 | 0 |
| 0.9902777777777777 | 0 |
| 0.9909722222222223 | 0 |
| 0.9916666666666667 | 0 |
| 0.9923611111111111 | 0 |
| 0.9930555555555555 | 0 |
| 0.99375 | 0 |
| 0.9944444444444445 | 0 |
| 0.9951388888888889 | 0 |
| 0.9958333333333332 | 0 |
| 0.9965277777777778 | 0 |
| 0.9972222222222222 | 0 |
| 0.9979166666666667 | 0 |
| 0.998611111111111 | 0 |
| 0.9993055555555556 | 0 |